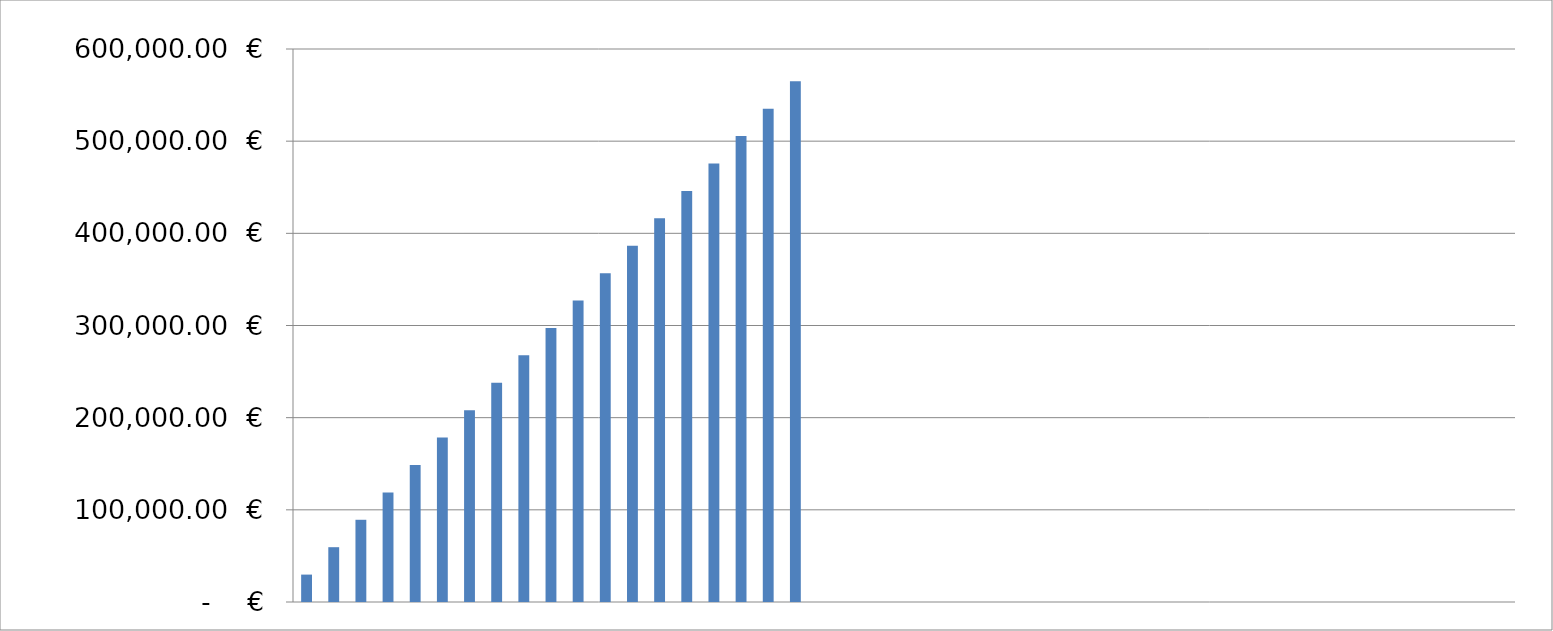
| Category | Gains potentiels cumulés en Euros par point gagné |
|---|---|
| 1.0 | 29735 |
| 2.0 | 59470 |
| 3.0 | 89205 |
| 4.0 | 118940 |
| 5.0 | 148675 |
| 6.0 | 178410 |
| 7.0 | 208145 |
| 8.0 | 237880 |
| 9.0 | 267615 |
| 0.0 | 297350 |
| 0.0 | 327085 |
| 0.0 | 356820 |
| 0.0 | 386555 |
| 0.0 | 416290 |
| 0.0 | 446025 |
| 0.0 | 475760 |
| 0.0 | 505495 |
| 0.0 | 535230 |
| 0.0 | 564965 |
| 0.0 | 0 |
| 0.0 | 0 |
| 0.0 | 0 |
| 0.0 | 0 |
| 0.0 | 0 |
| 0.0 | 0 |
| 0.0 | 0 |
| 0.0 | 0 |
| 0.0 | 0 |
| 0.0 | 0 |
| 0.0 | 0 |
| 0.0 | 0 |
| 0.0 | 0 |
| 0.0 | 0 |
| 0.0 | 0 |
| 0.0 | 0 |
| 0.0 | 0 |
| 0.0 | 0 |
| 0.0 | 0 |
| 0.0 | 0 |
| 0.0 | 0 |
| 0.0 | 0 |
| 0.0 | 0 |
| 0.0 | 0 |
| 0.0 | 0 |
| 0.0 | 0 |